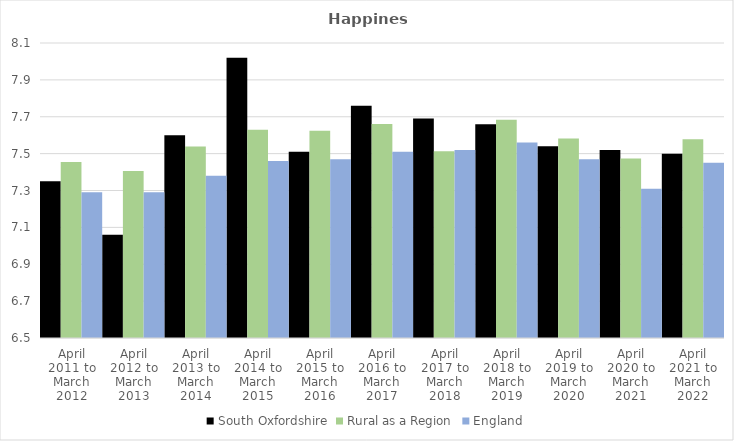
| Category | South Oxfordshire | Rural as a Region | England |
|---|---|---|---|
| April 2011 to March 2012 | 7.35 | 7.454 | 7.29 |
| April 2012 to March 2013 | 7.06 | 7.406 | 7.29 |
| April 2013 to March 2014 | 7.6 | 7.539 | 7.38 |
| April 2014 to March 2015 | 8.02 | 7.63 | 7.46 |
| April 2015 to March 2016 | 7.51 | 7.625 | 7.47 |
| April 2016 to March 2017 | 7.76 | 7.661 | 7.51 |
| April 2017 to March 2018 | 7.69 | 7.513 | 7.52 |
| April 2018 to March 2019 | 7.66 | 7.684 | 7.56 |
| April 2019 to March 2020 | 7.54 | 7.582 | 7.47 |
| April 2020 to March 2021 | 7.52 | 7.474 | 7.31 |
| April 2021 to March 2022 | 7.5 | 7.577 | 7.45 |